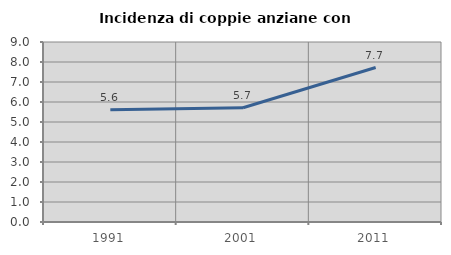
| Category | Incidenza di coppie anziane con figli |
|---|---|
| 1991.0 | 5.611 |
| 2001.0 | 5.714 |
| 2011.0 | 7.724 |